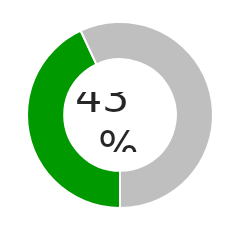
| Category | Series 0 |
|---|---|
| 0 | 0.431 |
| 1 | 0.569 |